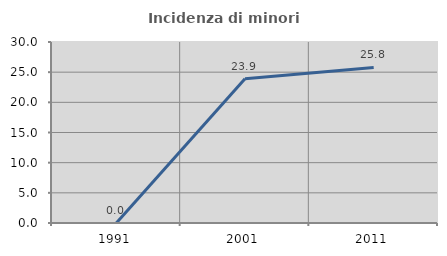
| Category | Incidenza di minori stranieri |
|---|---|
| 1991.0 | 0 |
| 2001.0 | 23.913 |
| 2011.0 | 25.781 |